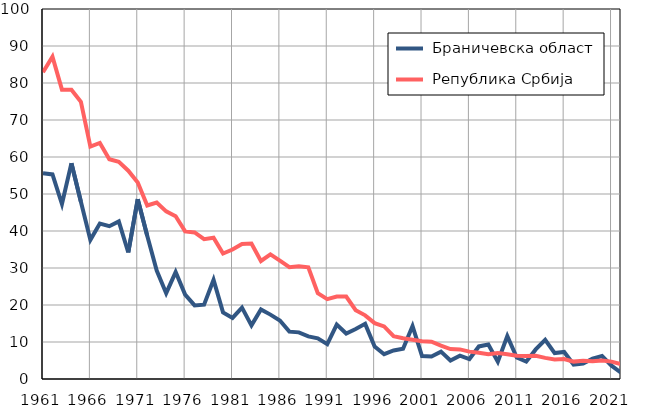
| Category |  Браничевска област |  Република Србија |
|---|---|---|
| 1961.0 | 55.6 | 82.9 |
| 1962.0 | 55.3 | 87.1 |
| 1963.0 | 47.3 | 78.2 |
| 1964.0 | 58.3 | 78.2 |
| 1965.0 | 47.9 | 74.9 |
| 1966.0 | 37.6 | 62.8 |
| 1967.0 | 42 | 63.8 |
| 1968.0 | 41.3 | 59.4 |
| 1969.0 | 42.6 | 58.7 |
| 1970.0 | 34.2 | 56.3 |
| 1971.0 | 48.6 | 53.1 |
| 1972.0 | 38.7 | 46.9 |
| 1973.0 | 29.3 | 47.7 |
| 1974.0 | 23.2 | 45.3 |
| 1975.0 | 28.9 | 44 |
| 1976.0 | 22.8 | 39.9 |
| 1977.0 | 19.9 | 39.6 |
| 1978.0 | 20.1 | 37.8 |
| 1979.0 | 26.8 | 38.2 |
| 1980.0 | 18 | 33.9 |
| 1981.0 | 16.5 | 35 |
| 1982.0 | 19.3 | 36.5 |
| 1983.0 | 14.5 | 36.6 |
| 1984.0 | 18.8 | 31.9 |
| 1985.0 | 17.4 | 33.7 |
| 1986.0 | 15.8 | 32 |
| 1987.0 | 12.8 | 30.2 |
| 1988.0 | 12.6 | 30.5 |
| 1989.0 | 11.5 | 30.2 |
| 1990.0 | 11 | 23.2 |
| 1991.0 | 9.4 | 21.6 |
| 1992.0 | 14.7 | 22.3 |
| 1993.0 | 12.3 | 22.3 |
| 1994.0 | 13.5 | 18.6 |
| 1995.0 | 14.9 | 17.2 |
| 1996.0 | 8.8 | 15.1 |
| 1997.0 | 6.7 | 14.2 |
| 1998.0 | 7.7 | 11.6 |
| 1999.0 | 8.2 | 11 |
| 2000.0 | 14.3 | 10.6 |
| 2001.0 | 6.2 | 10.2 |
| 2002.0 | 6.1 | 10.1 |
| 2003.0 | 7.4 | 9 |
| 2004.0 | 5 | 8.1 |
| 2005.0 | 6.3 | 8 |
| 2006.0 | 5.4 | 7.4 |
| 2007.0 | 8.8 | 7.1 |
| 2008.0 | 9.3 | 6.7 |
| 2009.0 | 4.7 | 7 |
| 2010.0 | 11.6 | 6.7 |
| 2011.0 | 5.8 | 6.3 |
| 2012.0 | 4.7 | 6.2 |
| 2013.0 | 8 | 6.3 |
| 2014.0 | 10.6 | 5.7 |
| 2015.0 | 7 | 5.3 |
| 2016.0 | 7.3 | 5.4 |
| 2017.0 | 3.9 | 4.7 |
| 2018.0 | 4.2 | 4.9 |
| 2019.0 | 5.5 | 4.8 |
| 2020.0 | 6.2 | 5 |
| 2021.0 | 3.6 | 4.7 |
| 2022.0 | 1.7 | 4 |